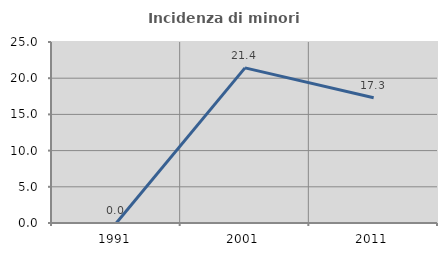
| Category | Incidenza di minori stranieri |
|---|---|
| 1991.0 | 0 |
| 2001.0 | 21.429 |
| 2011.0 | 17.308 |